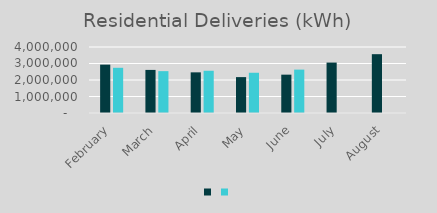
| Category | Series 1 | Series 0 |
|---|---|---|
| February | 2931022 | 2739688 |
| March | 2611486 | 2536769 |
| April | 2464085 | 2560197 |
| May | 2175066 | 2439036 |
| June | 2323720 | 2629934 |
| July | 3056084 | 0 |
| August | 3564883 | 0 |